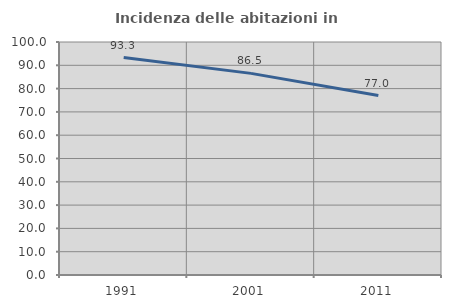
| Category | Incidenza delle abitazioni in proprietà  |
|---|---|
| 1991.0 | 93.333 |
| 2001.0 | 86.538 |
| 2011.0 | 77.005 |